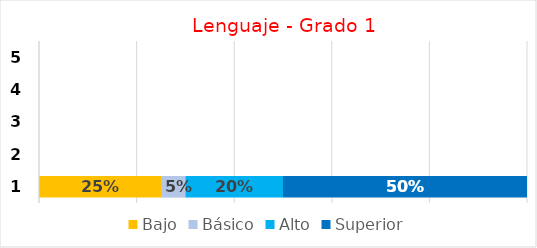
| Category | Bajo | Básico | Alto | Superior |
|---|---|---|---|---|
| 0 | 0.25 | 0.05 | 0.2 | 0.5 |
| 1 | 0 | 0 | 0 | 0 |
| 2 | 0 | 0 | 0 | 0 |
| 3 | 0 | 0 | 0 | 0 |
| 4 | 0 | 0 | 0 | 0 |